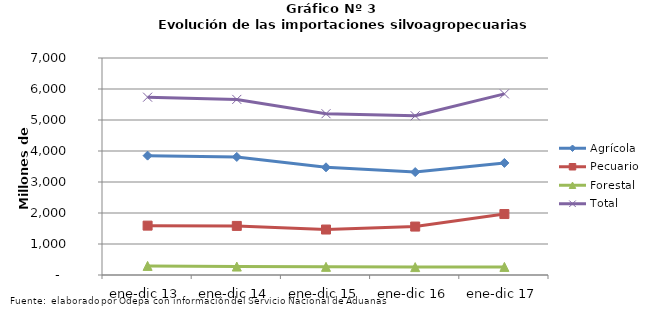
| Category | Agrícola | Pecuario | Forestal | Total |
|---|---|---|---|---|
| ene-dic 13 | 3850594 | 1592618 | 293106 | 5736318 |
| ene-dic 14 | 3808241 | 1583623 | 272603 | 5664467 |
| ene-dic 15 | 3474061 | 1466730 | 262751 | 5203542 |
| ene-dic 16 | 3320081 | 1562117 | 254803 | 5137001 |
| ene-dic 17 | 3615236 | 1966481 | 260600 | 5842317 |